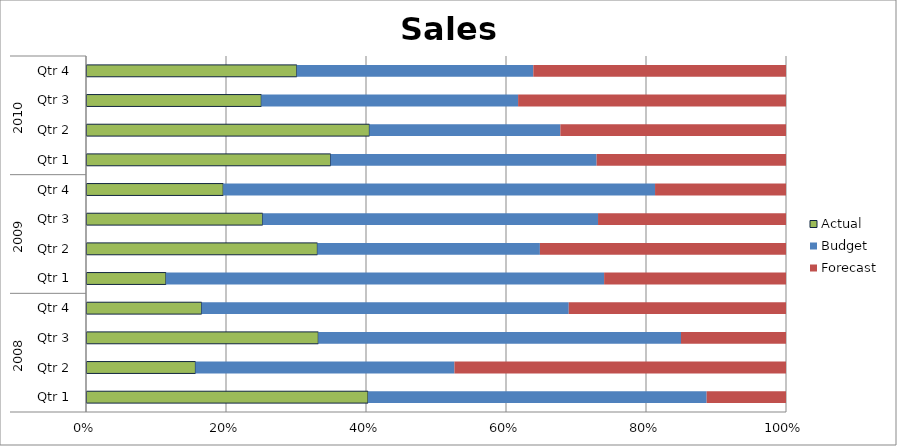
| Category | Actual | Budget | Forecast |
|---|---|---|---|
| 0 | 1990 | 2390 | 560 |
| 1 | 980 | 2320 | 2970 |
| 2 | 1460 | 2280 | 660 |
| 3 | 910 | 2890 | 1710 |
| 4 | 580 | 3180 | 1320 |
| 5 | 3140 | 3020 | 3340 |
| 6 | 1090 | 2070 | 1160 |
| 7 | 880 | 2770 | 840 |
| 8 | 2970 | 3230 | 2300 |
| 9 | 3190 | 2150 | 2540 |
| 10 | 1420 | 2080 | 2170 |
| 11 | 1960 | 2200 | 2350 |